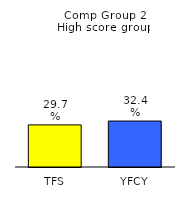
| Category | Series 0 |
|---|---|
| TFS | 0.297 |
| YFCY | 0.324 |